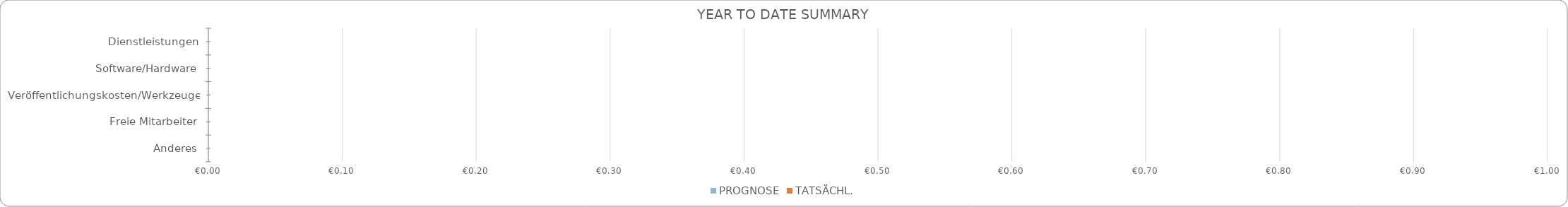
| Category | PROGNOSE | TATSÄCHL. |
|---|---|---|
| Dienstleistungen | 0 | 0 |
| Software/Hardware | 0 | 0 |
| Veröffentlichungskosten/Werkzeuge | 0 | 0 |
| Freie Mitarbeiter | 0 | 0 |
| Anderes | 0 | 0 |